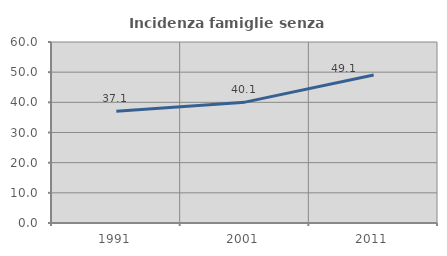
| Category | Incidenza famiglie senza nuclei |
|---|---|
| 1991.0 | 37.079 |
| 2001.0 | 40.065 |
| 2011.0 | 49.051 |